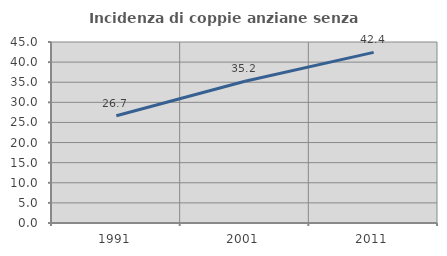
| Category | Incidenza di coppie anziane senza figli  |
|---|---|
| 1991.0 | 26.667 |
| 2001.0 | 35.246 |
| 2011.0 | 42.424 |